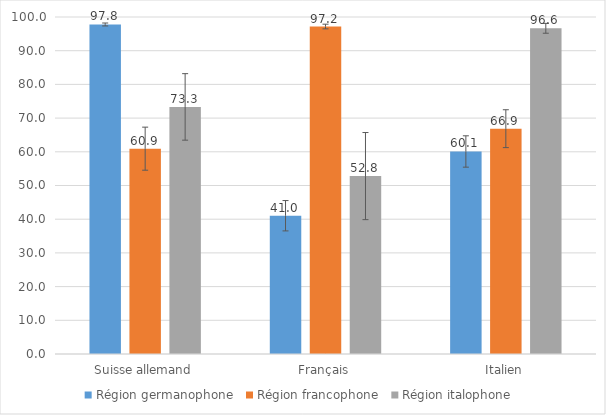
| Category | Région germanophone | Région francophone | Région italophone |
|---|---|---|---|
| Suisse allemand | 97.782 | 60.929 | 73.322 |
| Français | 41.032 | 97.178 | 52.795 |
| Italien | 60.093 | 66.861 | 96.645 |